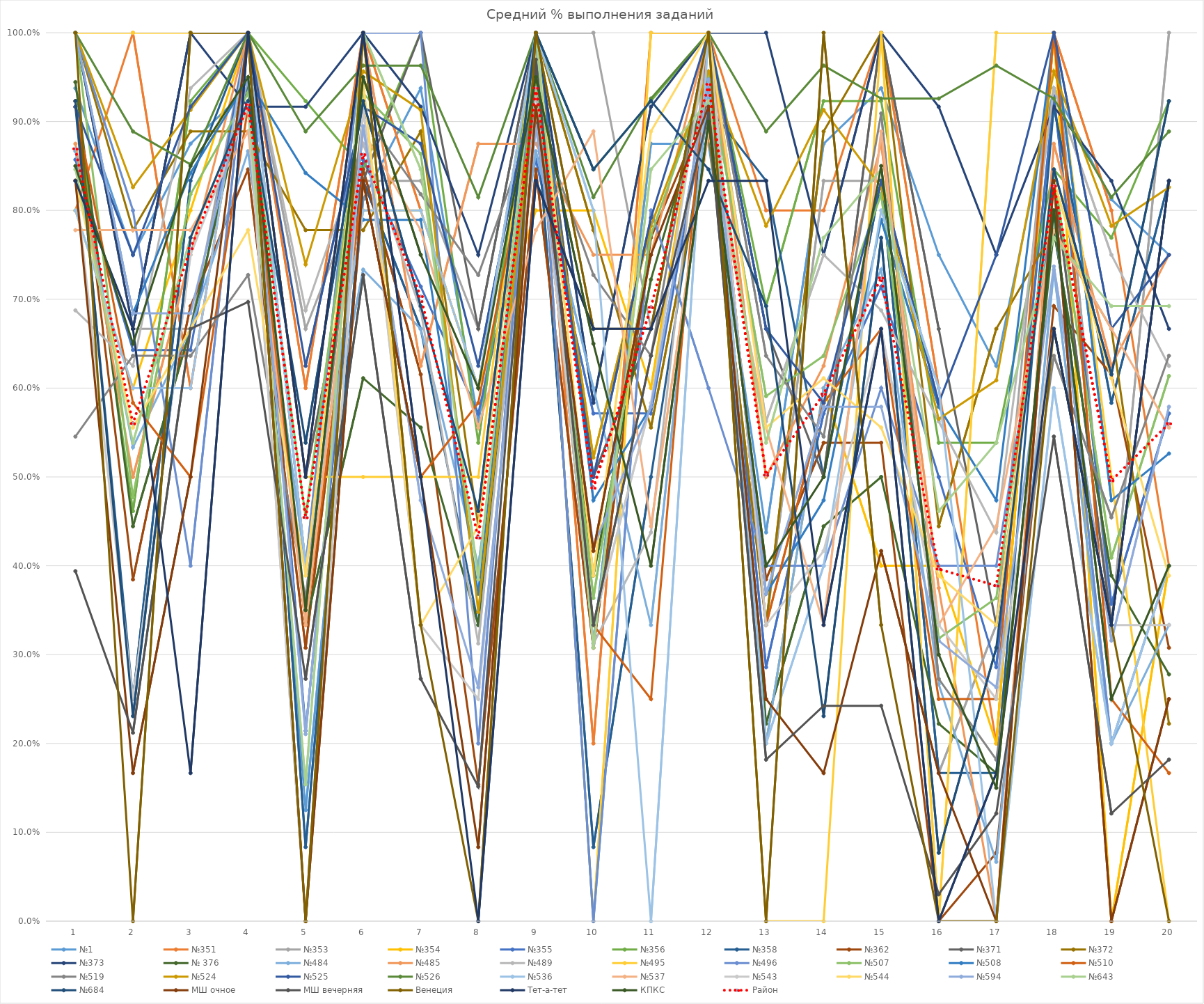
| Category | №1 | №351 | №353 | №354 | №355 | №356 | №358 | №362 | №371 | №372 | №373 | № 376 | №484 | №485 | №489 | №495 | №496 | №507 | №508 | №510 | №519 | №524 | №525 | №526 | №536 | №537 | №543 | №544 | №594 | №643 | №684 | МШ очное | МШ вечерняя | Венеция | Тет-а-тет | КПКС | Район |
|---|---|---|---|---|---|---|---|---|---|---|---|---|---|---|---|---|---|---|---|---|---|---|---|---|---|---|---|---|---|---|---|---|---|---|---|---|---|
| 0 | 0.938 | 0.8 | 1 | 0.8 | 0.857 | 0.923 | 0.917 | 0.923 | 1 | 1 | 1 | 0.944 | 0.867 | 0.875 | 0.688 | 1 | 1 | 1 | 1 | 0.917 | 0.545 | 1 | 0.917 | 1 | 0.8 | 0.778 | 0.833 | 0.833 | 1 | 0.846 | 0.923 | 0.833 | 0.394 | 1 | 0.833 | 0.85 | 0.869 |
| 1 | 0.75 | 1 | 0.667 | 0.6 | 0.643 | 0.462 | 0.25 | 0.385 | 0.667 | 0.778 | 0.667 | 0.444 | 0.533 | 0.5 | 0.625 | 1 | 0.8 | 0.477 | 0.684 | 0.583 | 0.636 | 0.826 | 0.75 | 0.889 | 0.6 | 0.778 | 0.25 | 0.556 | 0.684 | 0.538 | 0.231 | 0.167 | 0.212 | 0 | 0.667 | 0.65 | 0.56 |
| 2 | 0.875 | 0.6 | 0.667 | 0.8 | 0.643 | 0.923 | 0.833 | 0.692 | 1 | 0.889 | 1 | 0.667 | 0.667 | 0.75 | 0.938 | 1 | 0.4 | 0.818 | 0.842 | 0.5 | 0.636 | 0.913 | 0.917 | 0.852 | 0.6 | 0.778 | 0.75 | 0.667 | 0.684 | 0.769 | 0.769 | 0.5 | 0.667 | 1 | 0.167 | 0.85 | 0.757 |
| 3 | 0.938 | 1 | 1 | 1 | 1 | 1 | 1 | 0.846 | 1 | 0.889 | 0.917 | 0.944 | 0.867 | 1 | 1 | 1 | 1 | 0.932 | 0.947 | 0.917 | 0.727 | 1 | 1 | 1 | 1 | 0.889 | 0.917 | 0.778 | 0.947 | 0.923 | 0.923 | 1 | 0.697 | 1 | 1 | 0.95 | 0.919 |
| 4 | 0.125 | 0.6 | 0.667 | 0.4 | 0.214 | 0.923 | 0.083 | 0.308 | 0.5 | 0.778 | 0.917 | 0.333 | 0.4 | 0.5 | 0.688 | 0.5 | 0.4 | 0.455 | 0.842 | 0.333 | 0.364 | 0.739 | 0.625 | 0.889 | 0.4 | 0.333 | 0 | 0.389 | 0.211 | 0.154 | 0.538 | 0 | 0.273 | 0 | 0.5 | 0.35 | 0.454 |
| 5 | 0.812 | 1 | 0.833 | 0.8 | 0.857 | 0.846 | 0.833 | 0.846 | 0.833 | 0.778 | 1 | 0.611 | 0.733 | 1 | 0.875 | 0.5 | 1 | 0.932 | 0.789 | 0.833 | 0.909 | 0.957 | 0.917 | 0.963 | 0.8 | 0.889 | 0.917 | 0.944 | 0.895 | 1 | 0.923 | 0.833 | 0.727 | 1 | 1 | 0.95 | 0.863 |
| 6 | 0.938 | 0.8 | 0.833 | 0.8 | 0.714 | 1 | 0.667 | 0.615 | 1 | 0.889 | 0.917 | 0.556 | 0.667 | 0.625 | 0.688 | 0.5 | 1 | 0.864 | 0.789 | 0.5 | 0.818 | 0.913 | 0.875 | 0.963 | 0.8 | 0.778 | 0.333 | 0.333 | 0.474 | 0.846 | 0.692 | 0.5 | 0.273 | 0.333 | 0.5 | 0.75 | 0.703 |
| 7 | 0.562 | 0.6 | 0.667 | 0.6 | 0.571 | 0.538 | 0.333 | 0.154 | 0.667 | 0.444 | 0.75 | 0.333 | 0.4 | 0.875 | 0.312 | 0.5 | 0.2 | 0.386 | 0.368 | 0.583 | 0.727 | 0.348 | 0.625 | 0.815 | 0.6 | 0.556 | 0.25 | 0.444 | 0.263 | 0.385 | 0.462 | 0.083 | 0.152 | 0 | 0 | 0.6 | 0.432 |
| 8 | 0.938 | 1 | 1 | 0.8 | 0.857 | 1 | 0.917 | 0.846 | 1 | 1 | 1 | 0.944 | 0.867 | 0.875 | 0.938 | 1 | 1 | 0.955 | 1 | 0.917 | 0.909 | 0.957 | 0.958 | 1 | 1 | 0.778 | 0.917 | 1 | 0.895 | 1 | 1 | 0.917 | 0.97 | 1 | 0.833 | 0.95 | 0.938 |
| 9 | 0.312 | 0.2 | 1 | 0.8 | 0.571 | 0.846 | 0.083 | 0.308 | 0.5 | 0.778 | 0.583 | 0.389 | 0.6 | 0.75 | 0.312 | 0 | 0 | 0.364 | 0.474 | 0.333 | 0.727 | 0.522 | 0.5 | 0.815 | 0.8 | 0.889 | 0.333 | 0.389 | 0.421 | 0.308 | 0.846 | 0.417 | 0.333 | 0.667 | 0.667 | 0.65 | 0.488 |
| 10 | 0.875 | 1 | 0.667 | 0.6 | 0.571 | 0.923 | 0.5 | 0.769 | 0.667 | 0.556 | 0.917 | 0.722 | 0.333 | 0.75 | 0.438 | 1 | 0.8 | 0.773 | 0.579 | 0.25 | 0.636 | 0.783 | 0.792 | 0.926 | 0 | 0.444 | 0.583 | 0.889 | 0.579 | 0.846 | 0.923 | 0.75 | 0.636 | 0.667 | 0.667 | 0.4 | 0.691 |
| 11 | 0.875 | 1 | 1 | 1 | 0.929 | 1 | 0.917 | 0.923 | 1 | 0.889 | 1 | 0.944 | 0.933 | 1 | 1 | 1 | 0.6 | 0.955 | 0.947 | 1 | 1 | 0.957 | 1 | 1 | 1 | 0.889 | 1 | 1 | 0.947 | 0.923 | 0.846 | 0.917 | 0.909 | 1 | 0.833 | 0.9 | 0.942 |
| 12 | 0.438 | 0.8 | 0.333 | 0.2 | 0.286 | 0.692 | 0.833 | 0.385 | 0.667 | 0.333 | 1 | 0.222 | 0.2 | 0.5 | 0.562 | 0 | 0.4 | 0.591 | 0.368 | 0.333 | 0.636 | 0.783 | 0.667 | 0.889 | 0.2 | 0.556 | 0.333 | 0.556 | 0.368 | 0.538 | 0.692 | 0.25 | 0.182 | 0 | 0.833 | 0.4 | 0.502 |
| 13 | 0.875 | 0.8 | 0.833 | 0.6 | 0.571 | 0.923 | 0.5 | 0.538 | 0.5 | 0.889 | 0.75 | 0.444 | 0.6 | 0.625 | 0.75 | 0 | 0.4 | 0.636 | 0.474 | 0.583 | 0.545 | 0.913 | 0.583 | 0.963 | 0.4 | 0.333 | 0.417 | 0.611 | 0.579 | 0.769 | 0.231 | 0.167 | 0.242 | 1 | 0.333 | 0.5 | 0.593 |
| 14 | 0.938 | 1 | 0.833 | 0.4 | 0.714 | 0.923 | 0.833 | 0.538 | 1 | 1 | 1 | 0.5 | 0.733 | 0.875 | 0.688 | 1 | 0.6 | 0.818 | 0.789 | 0.667 | 0.909 | 0.826 | 0.833 | 0.926 | 0.8 | 0.889 | 0.667 | 0.556 | 0.579 | 0.846 | 0.769 | 0.417 | 0.242 | 0.333 | 0.667 | 0.85 | 0.724 |
| 15 | 0.75 | 0.6 | 0.167 | 0.4 | 0.5 | 0.538 | 0.167 | 0 | 0.667 | 0.444 | 0.917 | 0.222 | 0.267 | 0.375 | 0.562 | 0 | 0.4 | 0.318 | 0.579 | 0.25 | 0.273 | 0.565 | 0.583 | 0.926 | 0.6 | 0.333 | 0.333 | 0.389 | 0.316 | 0.462 | 0.077 | 0.167 | 0.03 | 0 | 0 | 0.3 | 0.396 |
| 16 | 0.625 | 0.2 | 0.333 | 0.2 | 0.286 | 0.538 | 0.167 | 0.077 | 0.333 | 0.667 | 0.75 | 0.167 | 0.067 | 0 | 0.438 | 1 | 0.4 | 0.364 | 0.474 | 0.25 | 0.182 | 0.609 | 0.75 | 0.963 | 0 | 0.444 | 0.25 | 0.333 | 0.263 | 0.538 | 0.308 | 0 | 0.121 | 0 | 0.167 | 0.15 | 0.378 |
| 17 | 0.938 | 1 | 1 | 1 | 0.929 | 0.846 | 0.917 | 0.692 | 0.833 | 0.778 | 0.917 | 0.778 | 0.733 | 0.875 | 0.938 | 1 | 0.8 | 0.841 | 1 | 1 | 0.636 | 0.957 | 1 | 0.926 | 0.6 | 0.778 | 0.667 | 0.833 | 0.737 | 0.769 | 0.846 | 0.833 | 0.545 | 0.667 | 0.667 | 0.8 | 0.828 |
| 18 | 0.812 | 0.8 | 0.333 | 0 | 0.357 | 0.769 | 0.583 | 0.615 | 0.333 | 0.667 | 0.833 | 0.389 | 0.2 | 0.625 | 0.75 | 0.5 | 0.2 | 0.409 | 0.474 | 0.25 | 0.455 | 0.783 | 0.667 | 0.815 | 0.2 | 0.667 | 0.333 | 0.611 | 0.316 | 0.692 | 0.615 | 0 | 0.121 | 0.333 | 0.333 | 0.25 | 0.496 |
| 19 | 0.75 | 0.4 | 1 | 0.4 | 0.571 | 0.923 | 0.833 | 0.308 | 0.833 | 0.222 | 0.667 | 0.278 | 0.333 | 0.75 | 0.625 | 0 | 0.4 | 0.614 | 0.526 | 0.167 | 0.636 | 0.826 | 0.75 | 0.889 | 0.4 | 0.556 | 0.333 | 0.389 | 0.579 | 0.692 | 0.923 | 0.25 | 0.182 | 0 | 0.833 | 0.4 | 0.56 |